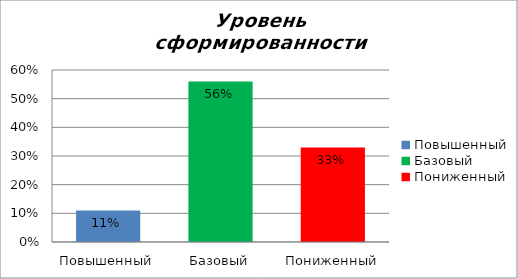
| Category | Уровень сформированности предметных результатов |
|---|---|
| Повышенный | 0.11 |
| Базовый | 0.56 |
| Пониженный | 0.33 |